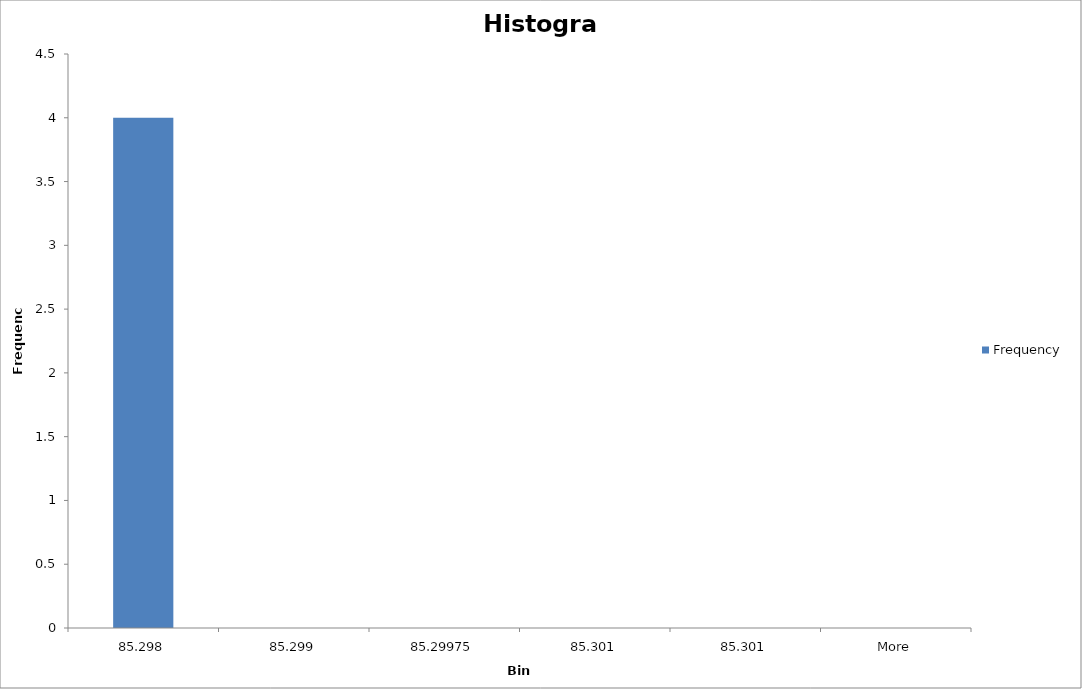
| Category | Frequency |
|---|---|
| 85.298 | 4 |
| 85.299 | 0 |
| 85.29975 | 0 |
| 85.301 | 0 |
| 85.301 | 0 |
| More | 0 |